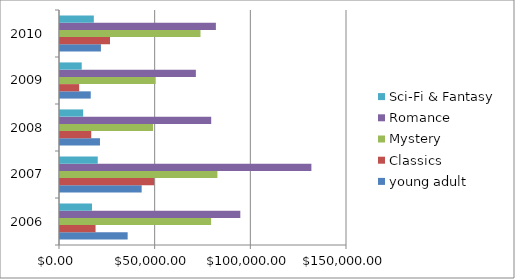
| Category | young adult | Classics | Mystery | Romance | Sci-Fi & Fantasy |
|---|---|---|---|---|---|
| 2006 | 35358 | 18580 | 78970 | 94236 | 16730 |
| 2007 | 42685 | 49225 | 82262 | 131390 | 19730 |
| 2008 | 20893 | 16326 | 48640 | 79022 | 12109 |
| 2009 | 16065 | 10017 | 49985 | 71009 | 11355 |
| 2010 | 21388 | 26134 | 73428 | 81474 | 17686 |